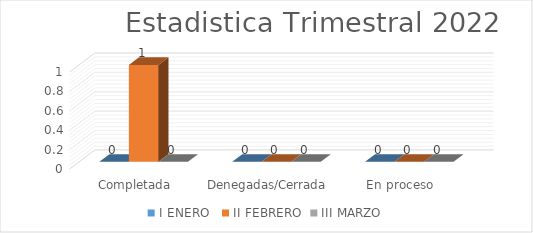
| Category | I | II | III |
|---|---|---|---|
| Completada | 0 | 1 | 0 |
| Denegadas/Cerrada | 0 | 0 | 0 |
| En proceso | 0 | 0 | 0 |